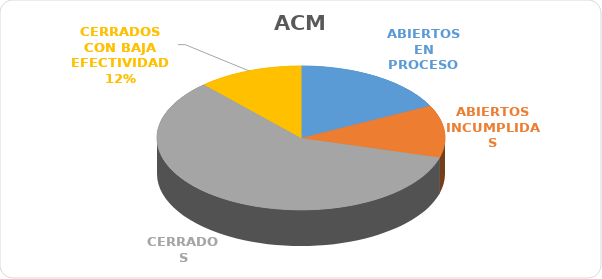
| Category | No. |
|---|---|
| ABIERTOS EN PROCESO | 3 |
| ABIERTOS INCUMPLIDAS | 2 |
| CERRADOS | 10 |
| CERRADOS CON BAJA EFECTIVIDAD | 2 |